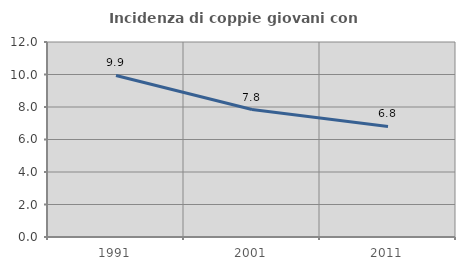
| Category | Incidenza di coppie giovani con figli |
|---|---|
| 1991.0 | 9.942 |
| 2001.0 | 7.843 |
| 2011.0 | 6.803 |